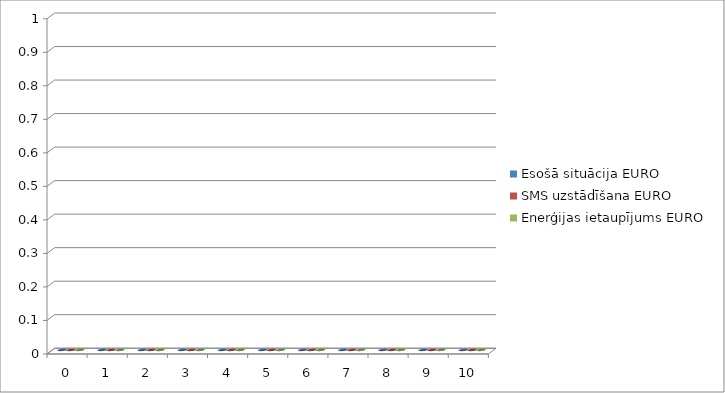
| Category | Esošā situācija EURO | SMS uzstādīšana EURO | Enerģijas ietaupījums EURO |
|---|---|---|---|
| 0.0 | 0 | 0 | 0 |
| 1.0 | 0 | 0 | 0 |
| 2.0 | 0 | 0 | 0 |
| 3.0 | 0 | 0 | 0 |
| 4.0 | 0 | 0 | 0 |
| 5.0 | 0 | 0 | 0 |
| 6.0 | 0 | 0 | 0 |
| 7.0 | 0 | 0 | 0 |
| 8.0 | 0 | 0 | 0 |
| 9.0 | 0 | 0 | 0 |
| 10.0 | 0 | 0 | 0 |